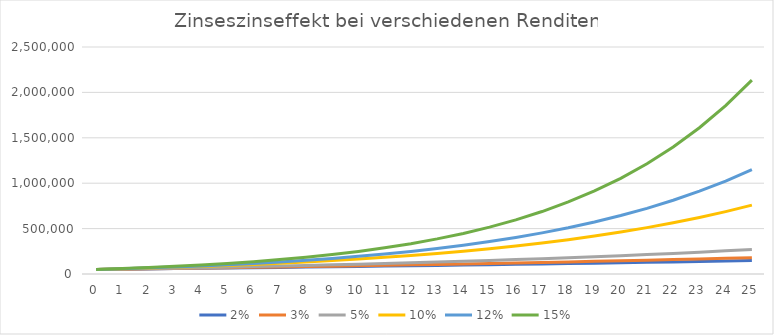
| Category | 2% | 3% | 5% | 10% | 12% | 15% |
|---|---|---|---|---|---|---|
| 0.0 | 50000 | 50000 | 50000 | 50000 | 50000 | 50000 |
| 1.0 | 53040 | 53560 | 54600 | 57200 | 58240 | 59800 |
| 2.0 | 56140.8 | 57226.8 | 59430 | 65120 | 67468.8 | 71070 |
| 3.0 | 59303.616 | 61003.604 | 64501.5 | 73832 | 77805.056 | 84030.5 |
| 4.0 | 62529.688 | 64893.712 | 69826.575 | 83415.2 | 89381.663 | 98935.075 |
| 5.0 | 65820.282 | 68900.523 | 75417.904 | 93956.72 | 102347.462 | 116075.336 |
| 6.0 | 69176.688 | 73027.539 | 81288.799 | 105552.392 | 116869.158 | 135786.637 |
| 7.0 | 72600.221 | 77278.365 | 87453.239 | 118307.631 | 133133.457 | 158454.632 |
| 8.0 | 76092.226 | 81656.716 | 93925.901 | 132338.394 | 151349.471 | 184522.827 |
| 9.0 | 79654.07 | 86166.418 | 100722.196 | 147772.234 | 171751.408 | 214501.251 |
| 10.0 | 83287.152 | 90811.41 | 107858.306 | 164749.457 | 194601.577 | 248976.439 |
| 11.0 | 86992.895 | 95595.753 | 115351.221 | 183424.403 | 220193.766 | 288622.905 |
| 12.0 | 90772.753 | 100523.625 | 123218.782 | 203966.843 | 248857.018 | 334216.34 |
| 13.0 | 94628.208 | 105599.334 | 131479.721 | 226563.527 | 280959.86 | 386648.791 |
| 14.0 | 98560.772 | 110827.314 | 140153.707 | 251419.88 | 316915.044 | 446946.11 |
| 15.0 | 102571.987 | 116212.133 | 149261.393 | 278761.868 | 357184.849 | 516288.026 |
| 16.0 | 106663.427 | 121758.497 | 158824.462 | 308838.055 | 402287.031 | 596031.23 |
| 17.0 | 110836.696 | 127471.252 | 168865.685 | 341921.861 | 452801.474 | 687735.915 |
| 18.0 | 115093.43 | 133355.39 | 179408.969 | 378314.047 | 509377.651 | 793196.302 |
| 19.0 | 119435.298 | 139416.052 | 190479.418 | 418345.451 | 572742.969 | 914475.748 |
| 20.0 | 123864.004 | 145658.533 | 202103.389 | 462379.996 | 643712.126 | 1053947.11 |
| 21.0 | 128381.284 | 152088.289 | 214308.558 | 510817.996 | 723197.581 | 1214339.176 |
| 22.0 | 132988.91 | 158710.938 | 227123.986 | 564099.796 | 812221.291 | 1398790.053 |
| 23.0 | 137688.688 | 165532.266 | 240580.186 | 622709.775 | 911927.845 | 1610908.56 |
| 24.0 | 142482.462 | 172558.234 | 254709.195 | 687180.753 | 1023599.187 | 1854844.844 |
| 25.0 | 147372.111 | 179794.981 | 269544.655 | 758098.828 | 1148671.089 | 2135371.571 |